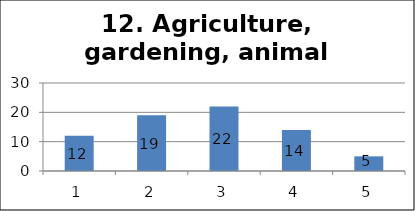
| Category | Series 1 |
|---|---|
| 0 | 12 |
| 1 | 19 |
| 2 | 22 |
| 3 | 14 |
| 4 | 5 |